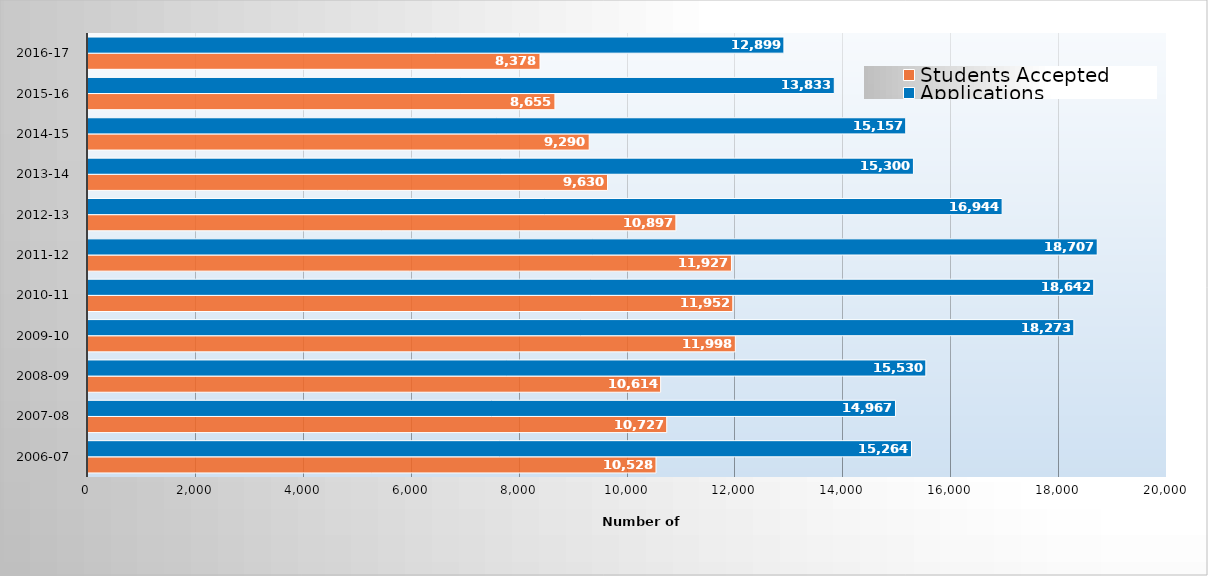
| Category | Students Accepted | Applications |
|---|---|---|
| 2006-07 | 10528 | 15264 |
| 2007-08 | 10727 | 14967 |
| 2008-09 | 10614 | 15530 |
| 2009-10 | 11998 | 18273 |
| 2010-11 | 11952 | 18642 |
| 2011-12 | 11927 | 18707 |
| 2012-13 | 10897 | 16944 |
| 2013-14 | 9630 | 15300 |
| 2014-15 | 9290 | 15157 |
| 2015-16 | 8655 | 13833 |
| 2016-17 | 8378 | 12899 |